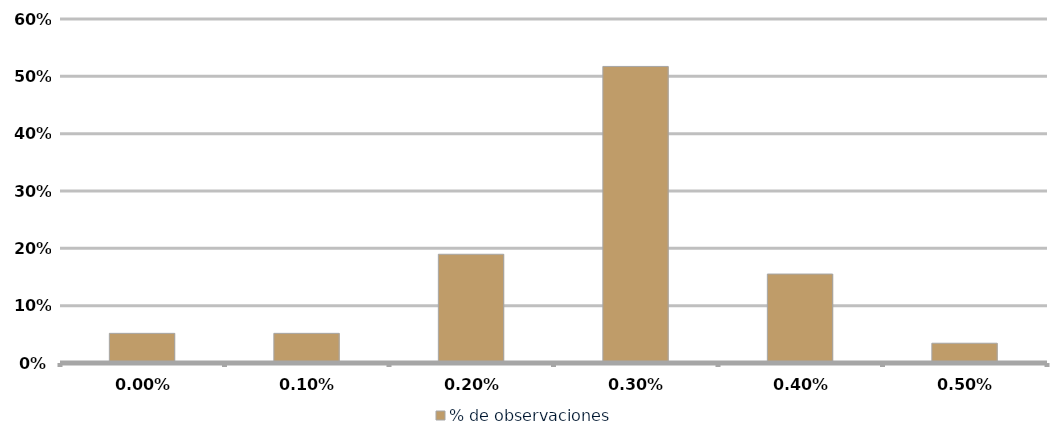
| Category | % de observaciones  |
|---|---|
| 0.0 | 0.052 |
| 0.001 | 0.052 |
| 0.002 | 0.19 |
| 0.003 | 0.517 |
| 0.004 | 0.155 |
| 0.005 | 0.034 |